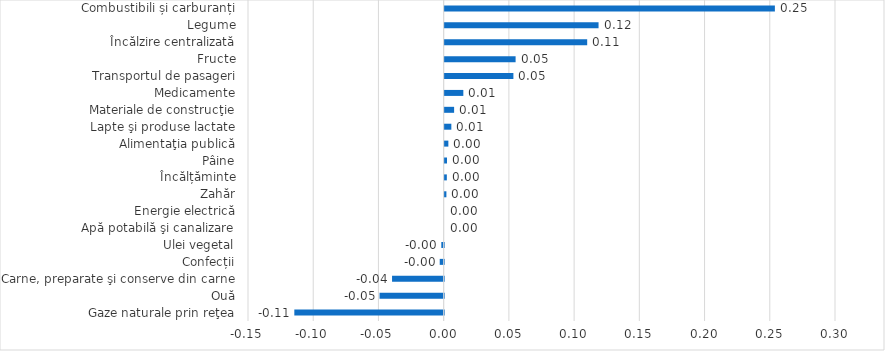
| Category | Series 0 |
|---|---|
| Gaze naturale prin reţea | -0.114 |
| Ouă | -0.049 |
| Carne, preparate şi conserve din carne | -0.04 |
| Confecții | -0.003 |
| Ulei vegetal | -0.002 |
| Apă potabilă şi canalizare | 0 |
| Energie electrică | 0 |
| Zahăr | 0.001 |
| Încălțăminte | 0.002 |
| Pâine | 0.002 |
| Alimentaţia publică | 0.003 |
| Lapte şi produse lactate | 0.005 |
| Materiale de construcţie | 0.007 |
| Medicamente | 0.014 |
| Transportul de pasageri | 0.053 |
| Fructe | 0.054 |
| Încălzire centralizată | 0.109 |
| Legume | 0.118 |
| Combustibili și carburanți | 0.253 |